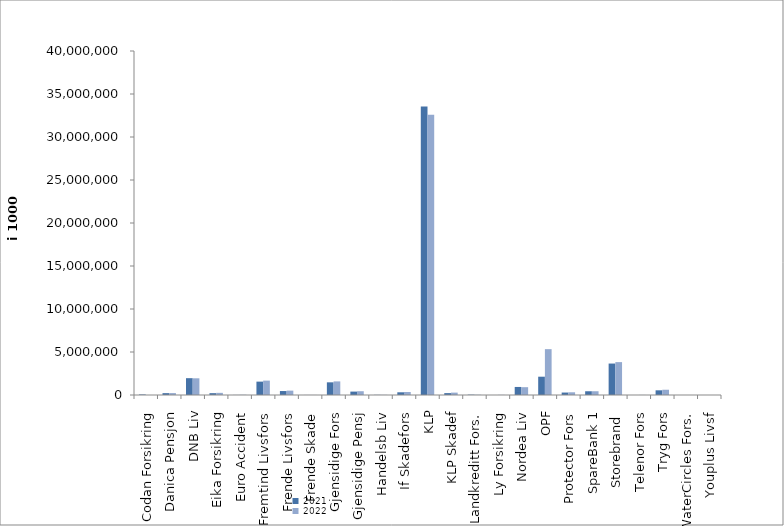
| Category | 2021 | 2022 |
|---|---|---|
| Codan Forsikring | 59890 | 0 |
| Danica Pensjon | 216101.857 | 223268.037 |
| DNB Liv | 1956247.765 | 1941687 |
| Eika Forsikring | 213759 | 250147 |
| Euro Accident | 8868.24 | 26443 |
| Fremtind Livsfors | 1554860.001 | 1672927.674 |
| Frende Livsfors | 460428 | 508054 |
| Frende Skade | 5314.415 | 6356.36 |
| Gjensidige Fors | 1474212.797 | 1581986.067 |
| Gjensidige Pensj | 395870 | 439850 |
| Handelsb Liv | 17644.03 | 17030.985 |
| If Skadefors | 315101.852 | 350741.561 |
| KLP | 33537381.302 | 32592177.503 |
| KLP Skadef | 219490.814 | 277149.278 |
| Landkreditt Fors. | 39431 | 26301 |
| Ly Forsikring | 0 | 13753.589 |
| Nordea Liv | 935655.99 | 908883.661 |
| OPF | 2128000 | 5331000 |
| Protector Fors | 285507.815 | 315226.973 |
| SpareBank 1 | 435411.445 | 437108.782 |
| Storebrand  | 3657110.181 | 3823393.788 |
| Telenor Fors | 686 | 7890 |
| Tryg Fors | 545103.8 | 611540 |
| WaterCircles Fors. | 1684 | 2120 |
| Youplus Livsf | 0 | 1993 |